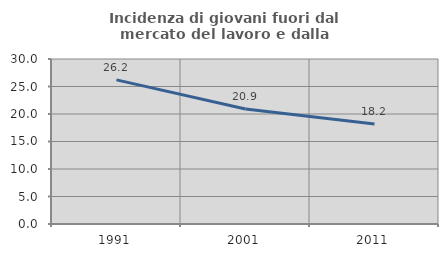
| Category | Incidenza di giovani fuori dal mercato del lavoro e dalla formazione  |
|---|---|
| 1991.0 | 26.203 |
| 2001.0 | 20.894 |
| 2011.0 | 18.163 |